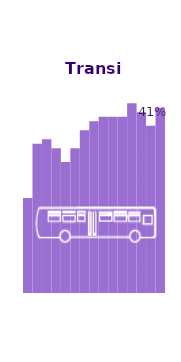
| Category | Transit |
|---|---|
| 1989.0 | 21 |
| 1992.0 | 33 |
| 1994.0 | 34 |
| 1996.0 | 32 |
| 1998.0 | 29 |
| 2000.0 | 32 |
| 2002.0 | 36 |
| 2004.0 | 38 |
| 2006.0 | 39 |
| 2008.0 | 39 |
| 2010.0 | 39 |
| 2012.0 | 42 |
| 2014.0 | 40 |
| 2015.0 | 37 |
| 2016.0 | 41 |